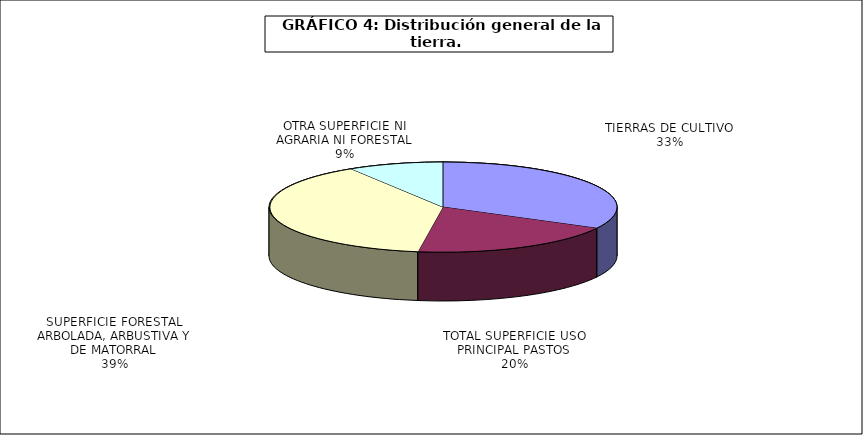
| Category | Series 0 |
|---|---|
| TIERRAS DE CULTIVO | 16578576.88 |
| TOTAL SUPERFICIE USO PRINCIPAL PASTOS | 9885842 |
| SUPERFICIE FORESTAL ARBOLADA, ARBUSTIVA Y DE MATORRAL | 19650403.69 |
| OTRA SUPERFICIE NI AGRARIA NI FORESTAL | 4483005.56 |